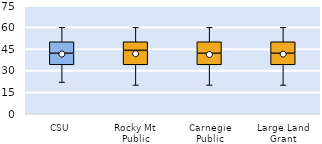
| Category | 25th | 50th | 75th |
|---|---|---|---|
| CSU | 34 | 8 | 8 |
| Rocky Mt Public | 34 | 10 | 6 |
| Carnegie Public | 34 | 8 | 8 |
| Large Land Grant | 34 | 8 | 8 |